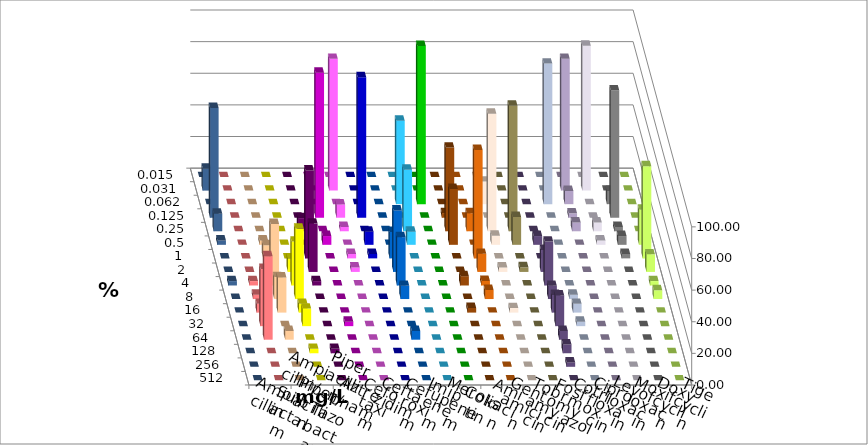
| Category | Ampicillin | Ampicillin/ Sulbactam | Piperacillin | Piperacillin/ Tazobactam | Aztreonam | Cefotaxim | Ceftazidim | Cefuroxim | Imipenem | Meropenem | Colistin | Amikacin | Gentamicin | Tobramycin | Fosfomycin | Cotrimoxazol | Ciprofloxacin | Levofloxacin | Moxifloxacin | Doxycyclin | Tigecyclin |
|---|---|---|---|---|---|---|---|---|---|---|---|---|---|---|---|---|---|---|---|---|---|
| 0.015 | 0 | 0 | 0 | 0 | 0 | 0 | 0 | 0 | 0 | 0 | 0 | 0 | 0 | 0 | 0 | 0 | 0 | 0 | 0 | 0 | 0 |
| 0.031 | 0 | 0 | 0 | 0 | 0 | 83.333 | 0 | 0 | 0 | 0 | 0 | 0 | 0 | 0 | 0 | 0 | 83.333 | 91.667 | 0 | 0 | 13.889 |
| 0.062 | 0 | 0 | 0 | 0 | 0 | 0 | 0 | 0 | 52.778 | 100 | 0 | 0 | 14.286 | 0 | 0 | 88.889 | 8.333 | 0 | 8.333 | 0 | 0 |
| 0.125 | 0 | 0 | 0 | 0 | 91.667 | 8.333 | 88.889 | 0 | 0 | 0 | 2.941 | 0 | 0 | 0 | 0 | 0 | 2.778 | 0 | 80.556 | 0 | 69.444 |
| 0.25 | 0 | 0 | 0 | 8.333 | 0 | 2.778 | 0 | 0 | 38.889 | 0 | 52.941 | 11.429 | 74.286 | 79.412 | 0 | 0 | 5.556 | 5.556 | 2.778 | 0 | 11.111 |
| 0.5 | 0 | 2.778 | 0 | 0 | 5.556 | 0 | 8.333 | 0 | 8.333 | 0 | 35.294 | 0 | 5.714 | 17.647 | 5.556 | 0 | 0 | 2.778 | 5.556 | 22.222 | 2.778 |
| 1.0 | 0 | 8.333 | 0 | 55.556 | 0 | 2.778 | 2.778 | 16.667 | 0 | 0 | 0 | 68.571 | 0 | 0 | 0 | 0 | 0 | 0 | 2.778 | 58.333 | 0 |
| 2.0 | 0 | 8.333 | 8.333 | 30.556 | 0 | 2.778 | 0 | 38.889 | 0 | 0 | 0 | 11.429 | 2.857 | 2.941 | 13.889 | 0 | 0 | 0 | 0 | 11.111 | 0 |
| 4.0 | 2.778 | 38.889 | 27.778 | 2.778 | 0 | 0 | 0 | 30.556 | 0 | 0 | 5.882 | 2.857 | 0 | 0 | 27.778 | 0 | 0 | 0 | 0 | 2.778 | 2.778 |
| 8.0 | 2.778 | 13.889 | 44.444 | 0 | 0 | 0 | 0 | 8.333 | 0 | 0 | 0 | 5.714 | 0 | 0 | 8.333 | 2.778 | 0 | 0 | 0 | 5.556 | 0 |
| 16.0 | 5.556 | 22.222 | 5.556 | 0 | 0 | 0 | 0 | 0 | 0 | 0 | 2.941 | 0 | 2.857 | 0 | 11.111 | 5.556 | 0 | 0 | 0 | 0 | 0 |
| 32.0 | 36.111 | 0 | 11.111 | 0 | 2.778 | 0 | 0 | 0 | 0 | 0 | 0 | 0 | 0 | 0 | 19.444 | 2.778 | 0 | 0 | 0 | 0 | 0 |
| 64.0 | 52.778 | 5.556 | 0 | 0 | 0 | 0 | 0 | 5.556 | 0 | 0 | 0 | 0 | 0 | 0 | 5.556 | 0 | 0 | 0 | 0 | 0 | 0 |
| 128.0 | 0 | 0 | 2.778 | 2.778 | 0 | 0 | 0 | 0 | 0 | 0 | 0 | 0 | 0 | 0 | 5.556 | 0 | 0 | 0 | 0 | 0 | 0 |
| 256.0 | 0 | 0 | 0 | 0 | 0 | 0 | 0 | 0 | 0 | 0 | 0 | 0 | 0 | 0 | 2.778 | 0 | 0 | 0 | 0 | 0 | 0 |
| 512.0 | 0 | 0 | 0 | 0 | 0 | 0 | 0 | 0 | 0 | 0 | 0 | 0 | 0 | 0 | 0 | 0 | 0 | 0 | 0 | 0 | 0 |